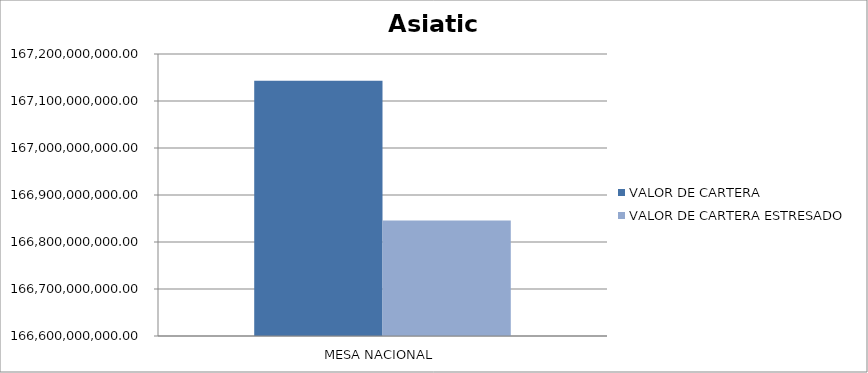
| Category | VALOR DE CARTERA | VALOR DE CARTERA ESTRESADO |
|---|---|---|
| MESA NACIONAL | 167143179737.301 | 166845855770.328 |